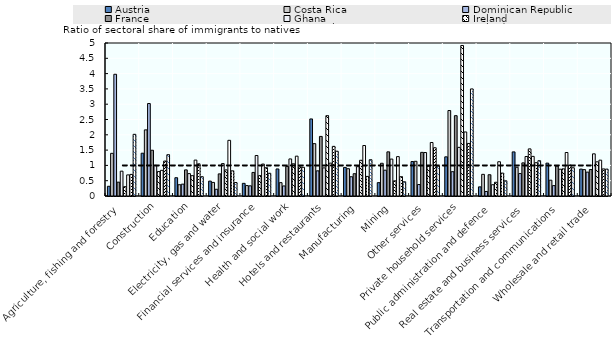
| Category | Austria | Costa Rica | Dominican Republic | France | Ghana | Ireland | Kyrgyzstan | Portugal | United States |
|---|---|---|---|---|---|---|---|---|---|
| Agriculture, fishing and forestry | 0.317 | 1.394 | 3.978 | 0.452 | 0.812 | 0.305 | 0.689 | 0.706 | 2.016 |
| Construction | 1.398 | 2.161 | 3.022 | 1.495 | 1.002 | 0.799 | 0.838 | 1.142 | 1.349 |
| Education | 0.598 | 0.369 | 0.387 | 0.854 | 0.732 | 0.664 | 1.174 | 1.051 | 0.631 |
| Electricity, gas and water | 0.486 | 0.444 | 0.22 | 0.723 | 1.059 | 0.853 | 1.819 | 0.822 | 0.44 |
| Financial services and insurance | 0.413 | 0.341 | 0.332 | 0.77 | 1.324 | 0.666 | 1.044 | 0.924 | 0.743 |
| Health and social work | 0.884 | 0.436 | 0.328 | 0.966 | 1.211 | 1.052 | 1.302 | 0.952 | 0.938 |
| Hotels and restaurants | 2.518 | 1.711 | 0.822 | 1.947 | 0.919 | 2.624 | 1.075 | 1.622 | 1.463 |
| Manufacturing | 0.935 | 0.892 | 0.629 | 0.729 | 0.958 | 1.167 | 1.65 | 0.64 | 1.185 |
| Mining | 0.436 | 1.07 | 0.843 | 1.443 | 1.207 | 0.495 | 1.287 | 0.631 | 0.465 |
| Other services | 1.126 | 1.134 | 0.375 | 1.426 | 1.42 | 0.971 | 1.749 | 1.577 | 0.982 |
| Private household services | 1.28 | 2.793 | 0.794 | 2.626 | 1.59 | 4.919 | 2.093 | 1.718 | 3.499 |
| Public administration and defence | 0.298 | 0.708 | 0.148 | 0.695 | 0.369 | 0.449 | 1.119 | 0.748 | 0.497 |
| Real estate and business services | 1.441 | 0.939 | 0.734 | 1.083 | 1.291 | 1.539 | 1.295 | 1.088 | 1.153 |
| Transportation and communications | 1.074 | 0.517 | 0.339 | 0.978 | 0.876 | 0.887 | 1.421 | 1.012 | 0.922 |
| Wholesale and retail trade | 0.879 | 0.862 | 0.781 | 0.864 | 1.378 | 1.118 | 1.171 | 0.885 | 0.879 |